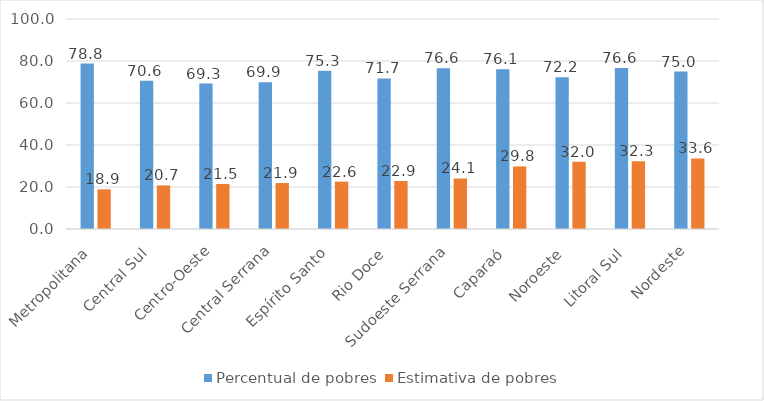
| Category | Percentual de pobres | Estimativa de pobres |
|---|---|---|
|  Metropolitana  | 78.763 | 18.889 |
|  Central Sul  | 70.626 | 20.743 |
| Centro-Oeste | 69.261 | 21.462 |
|  Central Serrana  | 69.851 | 21.889 |
|  Espírito Santo  | 75.335 | 22.551 |
|  Rio Doce  | 71.672 | 22.856 |
|  Sudoeste Serrana  | 76.559 | 24.052 |
|  Caparaó  | 76.105 | 29.778 |
|  Noroeste  | 72.222 | 32.008 |
|  Litoral Sul  | 76.645 | 32.301 |
|  Nordeste  | 74.972 | 33.62 |